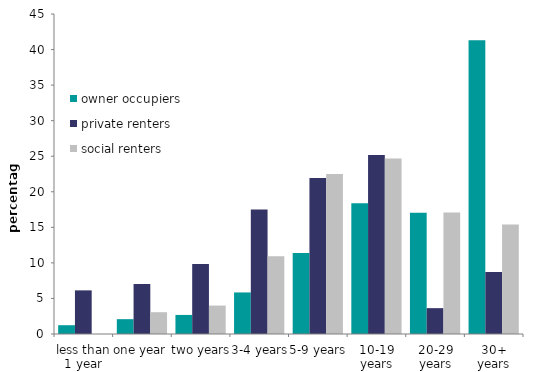
| Category | owner occupiers | private renters | social renters |
|---|---|---|---|
| less than 1 year | 1.237 | 6.137 | 0 |
| one year | 2.086 | 7.031 | 3.065 |
| two years | 2.682 | 9.847 | 4 |
| 3-4 years | 5.843 | 17.502 | 10.94 |
| 5-9 years | 11.405 | 21.932 | 22.505 |
| 10-19 years | 18.378 | 25.183 | 24.678 |
| 20-29 years | 17.057 | 3.636 | 17.085 |
| 30+ years | 41.312 | 8.733 | 15.407 |